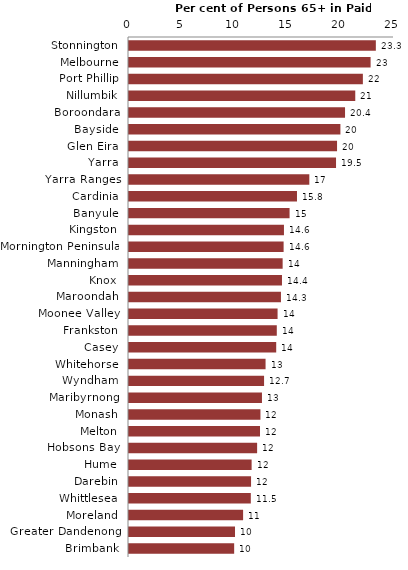
| Category | Series 0 |
|---|---|
| Stonnington | 23.287 |
| Melbourne | 22.792 |
| Port Phillip | 22.063 |
| Nillumbik | 21.345 |
| Boroondara | 20.381 |
| Bayside | 19.944 |
| Glen Eira | 19.627 |
| Yarra | 19.531 |
| Yarra Ranges | 17.012 |
| Cardinia | 15.848 |
| Banyule | 15.149 |
| Kingston | 14.619 |
| Mornington Peninsula | 14.586 |
| Manningham | 14.495 |
| Knox | 14.432 |
| Maroondah | 14.335 |
| Moonee Valley | 14.017 |
| Frankston | 13.943 |
| Casey | 13.887 |
| Whitehorse | 12.883 |
| Wyndham | 12.742 |
| Maribyrnong | 12.544 |
| Monash | 12.4 |
| Melton | 12.359 |
| Hobsons Bay | 12.087 |
| Hume | 11.568 |
| Darebin | 11.515 |
| Whittlesea | 11.491 |
| Moreland | 10.764 |
| Greater Dandenong | 10 |
| Brimbank | 9.921 |